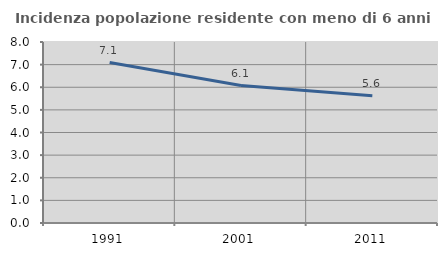
| Category | Incidenza popolazione residente con meno di 6 anni |
|---|---|
| 1991.0 | 7.093 |
| 2001.0 | 6.074 |
| 2011.0 | 5.626 |